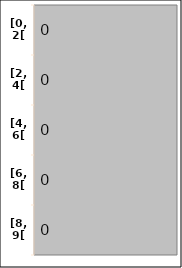
| Category | Series 0 |
|---|---|
| [0, 2[ | 0 |
| [2, 4[ | 0 |
| [4, 6[ | 0 |
| [6, 8[ | 0 |
| [8, 9[ | 0 |